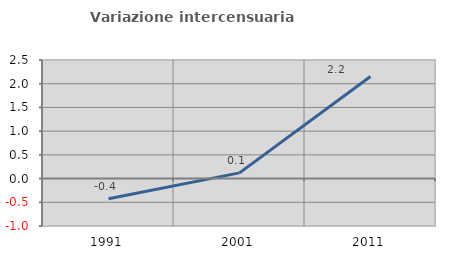
| Category | Variazione intercensuaria annua |
|---|---|
| 1991.0 | -0.427 |
| 2001.0 | 0.121 |
| 2011.0 | 2.153 |